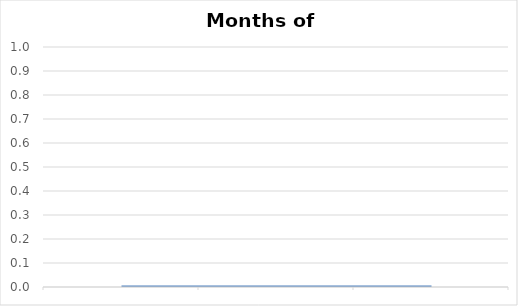
| Category | Series 0 |
|---|---|
|  | 0 |
|  | 0 |
|  | 0 |